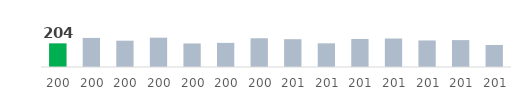
| Category | Total | Sel. Year |
|---|---|---|
| 2003.0 | 204 | 204 |
| 2004.0 | 252 | 0 |
| 2005.0 | 228 | 0 |
| 2006.0 | 254 | 0 |
| 2007.0 | 204 | 0 |
| 2008.0 | 209 | 0 |
| 2009.0 | 249 | 0 |
| 2010.0 | 241 | 0 |
| 2011.0 | 205 | 0 |
| 2012.0 | 243 | 0 |
| 2013.0 | 247 | 0 |
| 2014.0 | 230 | 0 |
| 2015.0 | 233 | 0 |
| 2016.0 | 191 | 0 |